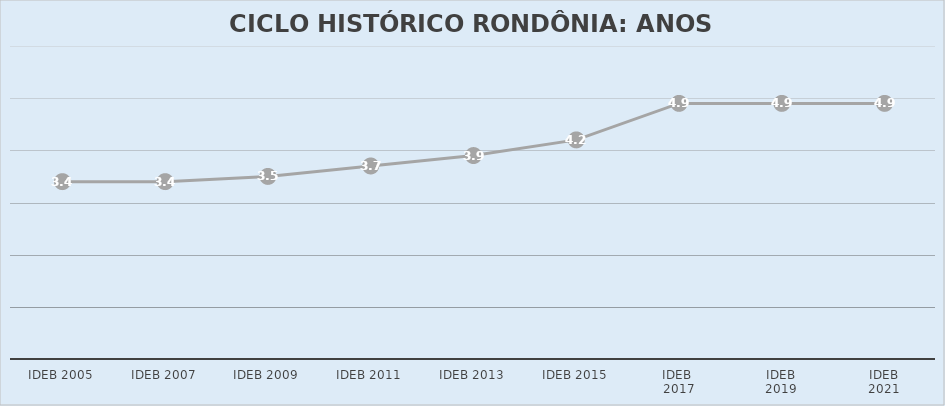
| Category | Series 0 | Series 1 | RONDÔNIA |
|---|---|---|---|
| IDEB 2005 |  |  | 3.4 |
| IDEB 2007 |  |  | 3.4 |
| IDEB 2009 |  |  | 3.5 |
| IDEB 2011 |  |  | 3.7 |
| IDEB 2013 |  |  | 3.9 |
| IDEB 2015 |  |  | 4.2 |
| IDEB 
2017 |  |  | 4.9 |
| IDEB
2019 |  |  | 4.9 |
| IDEB
2021 |  |  | 4.9 |